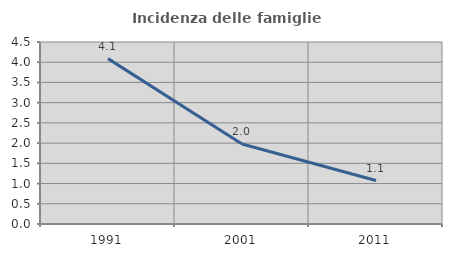
| Category | Incidenza delle famiglie numerose |
|---|---|
| 1991.0 | 4.089 |
| 2001.0 | 1.977 |
| 2011.0 | 1.074 |